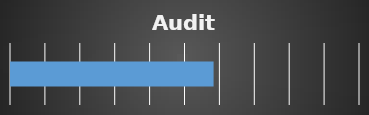
| Category | Series 0 |
|---|---|
| 0 | 58.333 |